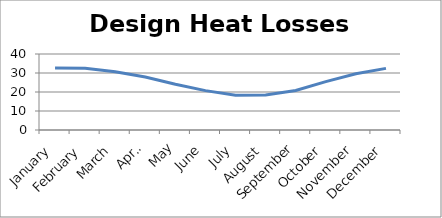
| Category | Design Heat Losses |
|---|---|
| January | 32.567 |
| February | 32.46 |
| March | 30.687 |
| April | 27.866 |
| May | 24.077 |
| June | 20.732 |
| July | 18.341 |
| August | 18.475 |
| September | 20.786 |
| October | 25.488 |
| November | 29.598 |
| December | 32.446 |